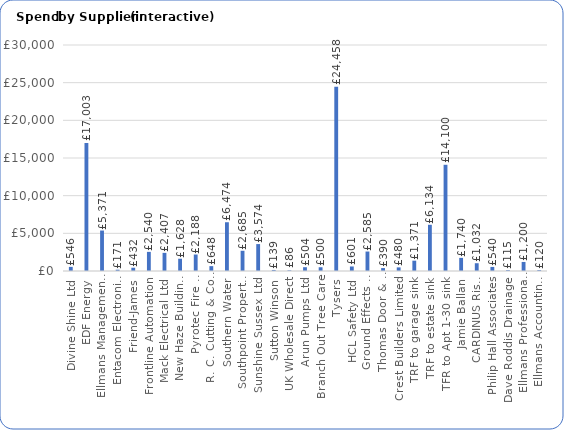
| Category | Total |
|---|---|
| Divine Shine Ltd | 546 |
| EDF Energy | 17002.84 |
| Ellmans Management Fee | 5370.76 |
| Entacom Electronic Security Systems | 171 |
| Friend-James | 432 |
| Frontline Automation | 2539.74 |
| Mack Electrical Ltd | 2406.96 |
| New Haze Building Services Ltd | 1628.22 |
| Pyrotec Fire Protection Ltd | 2188.2 |
| R. C. Cutting & Co. Ltd. | 648 |
| Southern Water | 6474 |
| Southpoint Property Maintenance | 2685 |
| Sunshine Sussex Ltd | 3573.5 |
| Sutton Winson | 138.74 |
| UK Wholesale Direct | 86.12 |
| Arun Pumps Ltd | 503.8 |
| Branch Out Tree Care | 500 |
| Tysers | 24458.12 |
| HCL Safety Ltd | 601.2 |
| Ground Effects Garden Services | 2585 |
| Thomas Door & Window Controls | 390 |
| Crest Builders Limited | 480 |
| TRF to garage sink | 1371 |
| TRF to estate sink | 6134 |
| TFR to Apt 1-30 sink | 14100 |
| Jamie Ballan | 1740 |
| CARDINUS Risk Management | 1032 |
| Philip Hall Associates | 540 |
| Dave Roddis Drainage | 115 |
| Ellmans Professional Fee | 1200 |
| Ellmans Accounting Fee | 120 |